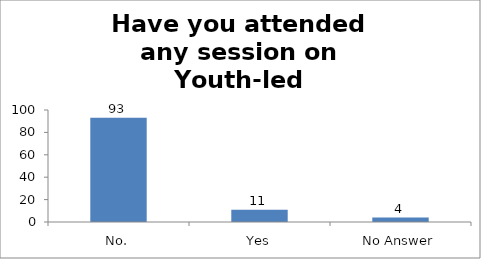
| Category | Have you attended any session on Youth-led Changemaking before? |
|---|---|
| No. | 93 |
| Yes | 11 |
| No Answer | 4 |